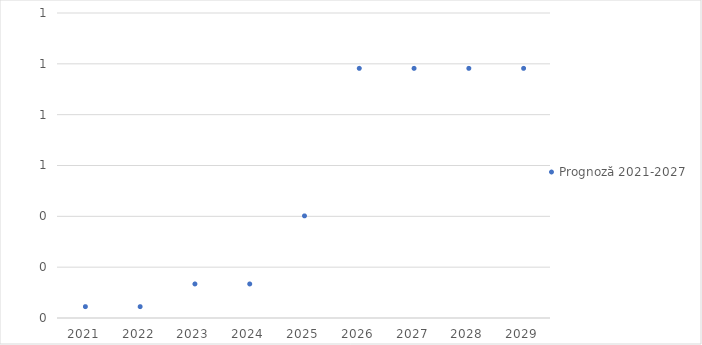
| Category | Prognoză 2021-2027 |
|---|---|
| 2021.0 | 0.045 |
| 2022.0 | 0.045 |
| 2023.0 | 0.134 |
| 2024.0 | 0.134 |
| 2025.0 | 0.402 |
| 2026.0 | 0.982 |
| 2027.0 | 0.982 |
| 2028.0 | 0.982 |
| 2029.0 | 0.982 |